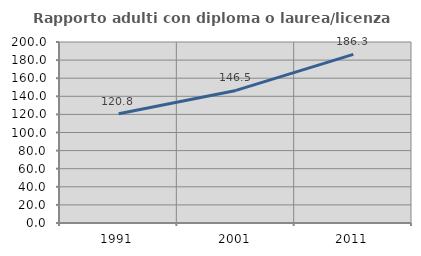
| Category | Rapporto adulti con diploma o laurea/licenza media  |
|---|---|
| 1991.0 | 120.782 |
| 2001.0 | 146.512 |
| 2011.0 | 186.336 |